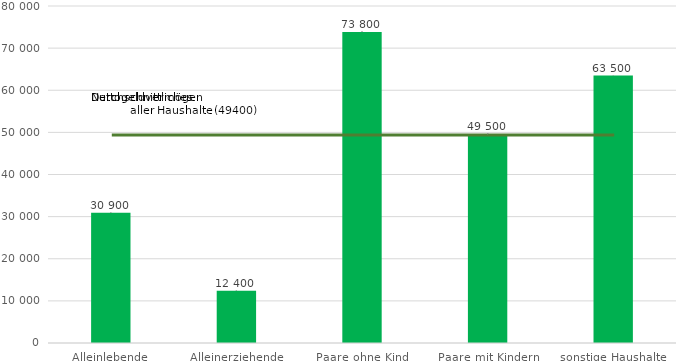
| Category | Series 5 |
|---|---|
| Alleinlebende | 30900 |
| Alleinerziehende | 12400 |
| Paare ohne Kind | 73800 |
| Paare mit Kindern | 49500 |
| sonstige Haushalte | 63500 |